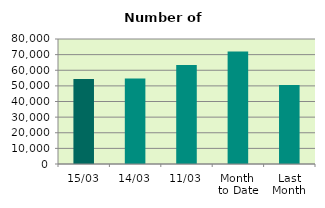
| Category | Series 0 |
|---|---|
| 15/03 | 54386 |
| 14/03 | 54792 |
| 11/03 | 63414 |
| Month 
to Date | 72044 |
| Last
Month | 50484.7 |